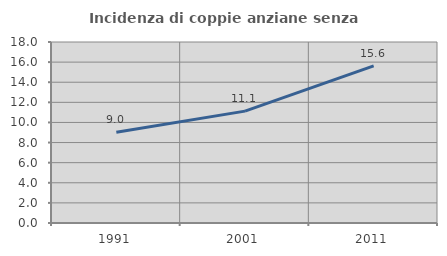
| Category | Incidenza di coppie anziane senza figli  |
|---|---|
| 1991.0 | 9.015 |
| 2001.0 | 11.126 |
| 2011.0 | 15.632 |